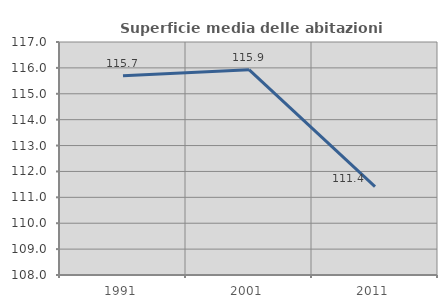
| Category | Superficie media delle abitazioni occupate |
|---|---|
| 1991.0 | 115.695 |
| 2001.0 | 115.932 |
| 2011.0 | 111.416 |